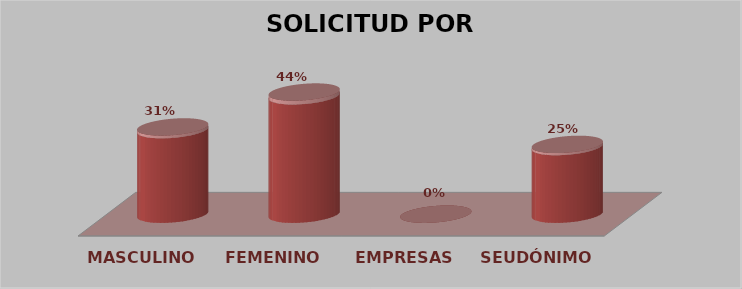
| Category | SOLICITUD POR GÉNERO | Series 1 |
|---|---|---|
| MASCULINO | 10 | 0.312 |
| FEMENINO | 14 | 0.438 |
| EMPRESAS | 0 | 0 |
| SEUDÓNIMO | 8 | 0.25 |